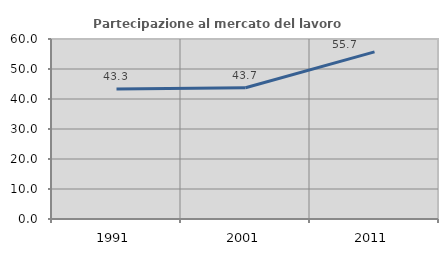
| Category | Partecipazione al mercato del lavoro  femminile |
|---|---|
| 1991.0 | 43.311 |
| 2001.0 | 43.737 |
| 2011.0 | 55.694 |